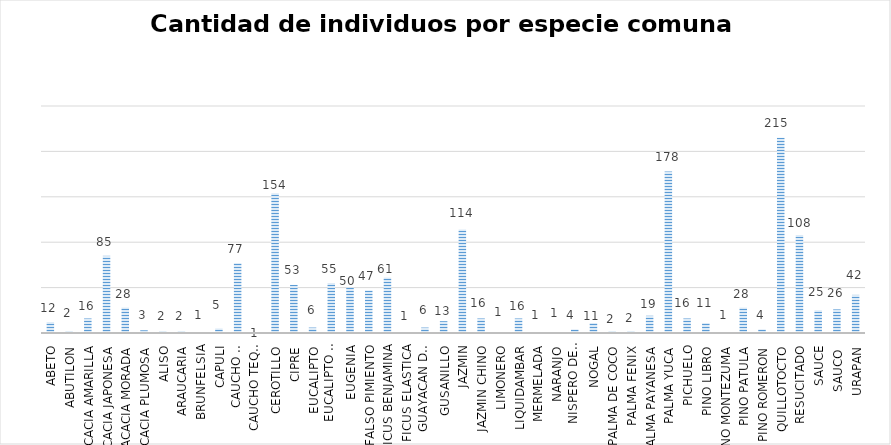
| Category | Series 0 |
|---|---|
| ABETO | 12 |
| ABUTILON | 2 |
| ACACIA AMARILLA | 16 |
| ACACIA JAPONESA | 85 |
| ACACIA MORADA | 28 |
| ACACIA PLUMOSA | 3 |
| ALISO | 2 |
| ARAUCARIA | 2 |
| BRUNFELSIA | 1 |
| CAPULI | 5 |
| CAUCHO SABANERO | 77 |
| CAUCHO TEQUENDAMA | 1 |
| CEROTILLO | 154 |
| CIPRE | 53 |
| EUCALIPTO | 6 |
| EUCALIPTO POMARROSO | 55 |
| EUGENIA | 50 |
| FALSO PIMIENTO | 47 |
| FICUS BENJAMINA | 61 |
| FICUS ELASTICA | 1 |
| GUAYACAN DE MANIZALES | 6 |
| GUSANILLO | 13 |
| JAZMIN | 114 |
| JAZMIN CHINO | 16 |
| LIMONERO | 1 |
| LIQUIDAMBAR | 16 |
| MERMELADA | 1 |
| NARANJO | 1 |
| NISPERO DEL JAPON | 4 |
| NOGAL | 11 |
| PALMA DE COCO | 2 |
| PALMA FENIX | 2 |
| PALMA PAYANESA | 19 |
| PALMA YUCA | 178 |
| PICHUELO | 16 |
| PINO LIBRO | 11 |
| PINO MONTEZUMA | 1 |
| PINO PATULA | 28 |
| PINO ROMERON | 4 |
| QUILLOTOCTO | 215 |
| RESUCITADO | 108 |
| SAUCE | 25 |
| SAUCO  | 26 |
| URAPAN | 42 |